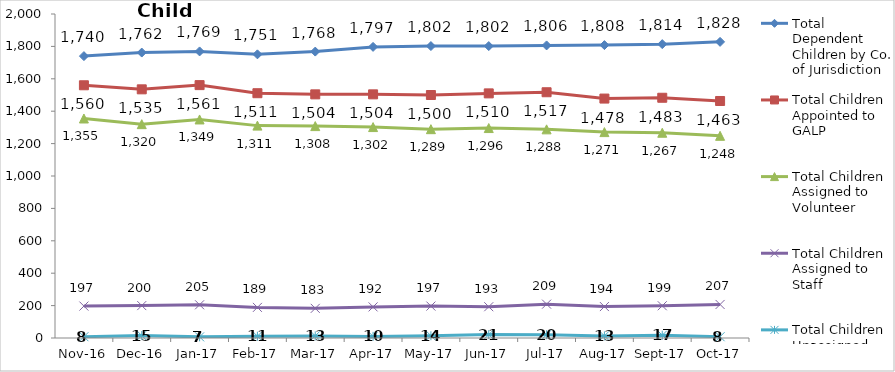
| Category | Total Dependent Children by Co. of Jurisdiction | Total Children Appointed to GALP | Total Children Assigned to Volunteer | Total Children Assigned to Staff | Total Children Unassigned |
|---|---|---|---|---|---|
| 2016-11-01 | 1740 | 1560 | 1355 | 197 | 8 |
| 2016-12-01 | 1762 | 1535 | 1320 | 200 | 15 |
| 2017-01-01 | 1769 | 1561 | 1349 | 205 | 7 |
| 2017-02-01 | 1751 | 1511 | 1311 | 189 | 11 |
| 2017-03-01 | 1768 | 1504 | 1308 | 183 | 13 |
| 2017-04-01 | 1797 | 1504 | 1302 | 192 | 10 |
| 2017-05-01 | 1802 | 1500 | 1289 | 197 | 14 |
| 2017-06-01 | 1802 | 1510 | 1296 | 193 | 21 |
| 2017-07-01 | 1806 | 1517 | 1288 | 209 | 20 |
| 2017-08-01 | 1808 | 1478 | 1271 | 194 | 13 |
| 2017-09-01 | 1814 | 1483 | 1267 | 199 | 17 |
| 2017-10-01 | 1828 | 1463 | 1248 | 207 | 8 |